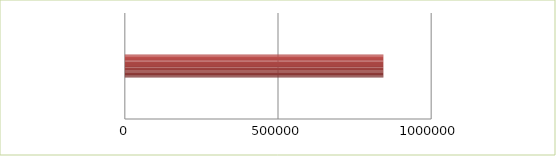
| Category | Series 0 | Series 1 |
|---|---|---|
| 0 | 2.5 | 0 |
| 1 | 2.6 | 844000 |
| 2 | 2.7 | 0 |